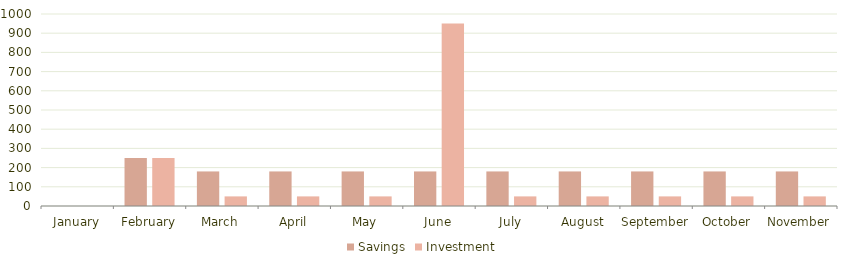
| Category | Savings | Investment |
|---|---|---|
| January | 0 | 0 |
| February | 250 | 250 |
| March | 180 | 50 |
| April | 180 | 50 |
| May | 180 | 50 |
| June | 180 | 950 |
| July | 180 | 50 |
| August | 180 | 50 |
| September | 180 | 50 |
| October | 180 | 50 |
| November | 180 | 50 |